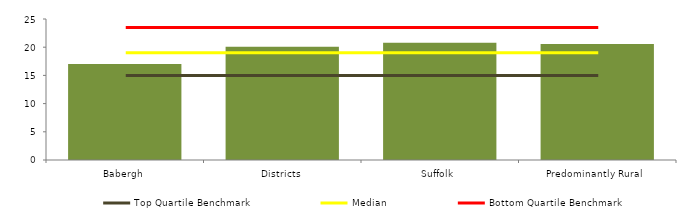
| Category | Block Data |
|---|---|
| Babergh | 17 |
| Districts | 20.067 |
| Suffolk | 20.8 |
|  Predominantly Rural   | 20.576 |